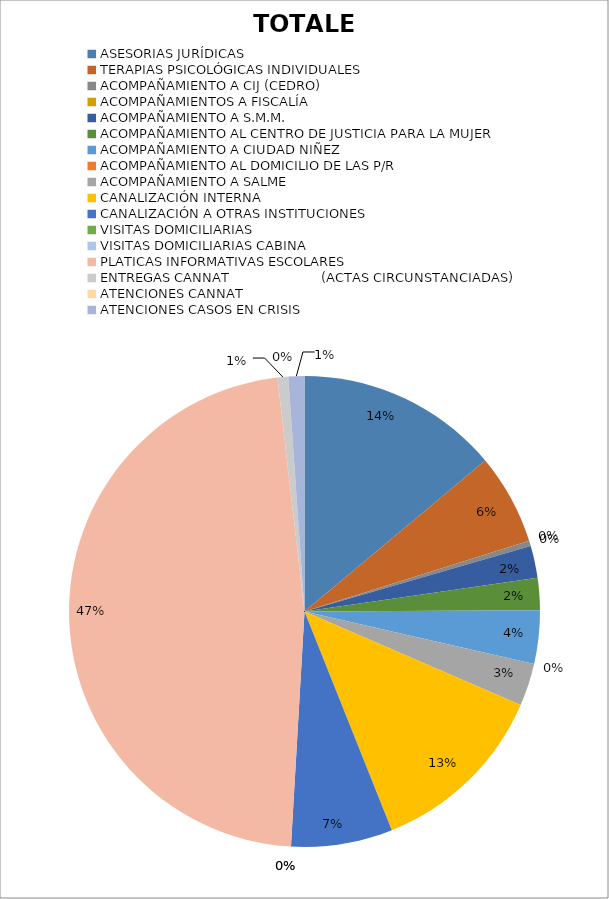
| Category | TOTALES |
|---|---|
| ASESORIAS JURÍDICAS | 38 |
| TERAPIAS PSICOLÓGICAS INDIVIDUALES | 17 |
| ACOMPAÑAMIENTO A CIJ (CEDRO) | 1 |
| ACOMPAÑAMIENTOS A FISCALÍA | 0 |
| ACOMPAÑAMIENTO A S.M.M. | 6 |
| ACOMPAÑAMIENTO AL CENTRO DE JUSTICIA PARA LA MUJER | 6 |
| ACOMPAÑAMIENTO A CIUDAD NIÑEZ  | 10 |
| ACOMPAÑAMIENTO AL DOMICILIO DE LAS P/R | 0 |
| ACOMPAÑAMIENTO A SALME | 8 |
| CANALIZACIÓN INTERNA | 34 |
| CANALIZACIÓN A OTRAS INSTITUCIONES | 19 |
| VISITAS DOMICILIARIAS | 0 |
| VISITAS DOMICILIARIAS CABINA | 0 |
| PLATICAS INFORMATIVAS ESCOLARES | 129 |
| ENTREGAS CANNAT                       (ACTAS CIRCUNSTANCIADAS) | 2 |
| ATENCIONES CANNAT | 0 |
| ATENCIONES CASOS EN CRISIS | 3 |